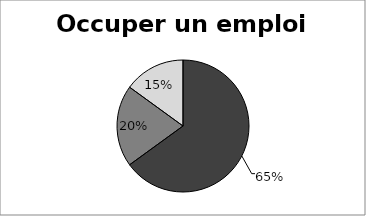
| Category | Occuper un emploi stable |
|---|---|
| 0 | 0.65 |
| 1 | 0.2 |
| 2 | 0.15 |